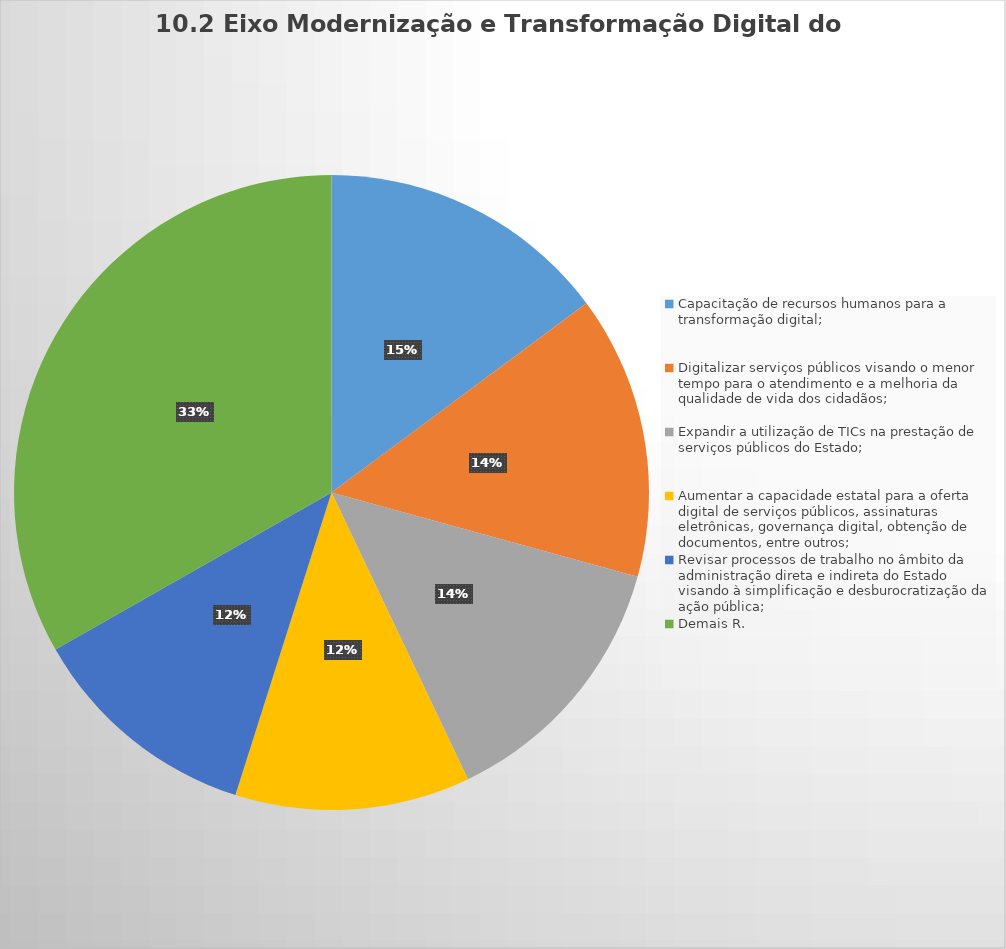
| Category | Series 0 |
|---|---|
| Capacitação de recursos humanos para a transformação digital;‬ | 150 |
| Digitalizar ‬‭serviços ‬‭públicos ‬‭visando ‬‭o ‬‭menor‬ ‭tempo ‬‭para ‬‭o‬ ‭atendimento ‬‭e ‬‭a ‬‭melhoria‬ ‭da ‬‭qualidade‬ de vida dos cidadãos;‬ | 146 |
| Expandir a utilização de TICs na prestação de serviços públicos do Estado;‬ | 138 |
| Aumentar a capacidade estatal para a oferta digital de serviços públicos, assinaturas eletrônicas, governança digital, obtenção de documentos, entre outros; | 121 |
| Revisar‬ ‭processos‬ ‭de‬ ‭trabalho ‬‭no ‬‭âmbito ‬‭da ‬‭administração ‬‭direta‬ ‭e ‬‭indireta ‬‭do ‬‭Estado‬‭ visando‬‭ à‬ simplificação e desburocratização da ação pública;‬ | 120 |
| Demais R. | 336 |